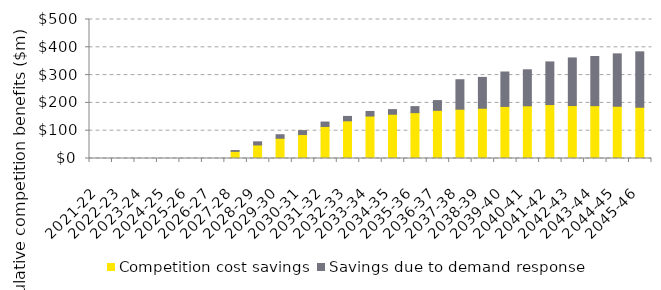
| Category | Competition cost savings | Savings due to demand response |
|---|---|---|
| 2021-22 | 0 | 0 |
| 2022-23 | 0 | 0 |
| 2023-24 | 0 | 0 |
| 2024-25 | 0 | 0 |
| 2025-26 | 0 | 0 |
| 2026-27 | 0 | 0 |
| 2027-28 | 25.619 | 3.027 |
| 2028-29 | 48.653 | 11.352 |
| 2029-30 | 72.781 | 12.762 |
| 2030-31 | 86.169 | 14.212 |
| 2031-32 | 115.223 | 15.941 |
| 2032-33 | 135.513 | 15.846 |
| 2033-34 | 152.656 | 16.566 |
| 2034-35 | 159.202 | 16.649 |
| 2035-36 | 164.921 | 21.783 |
| 2036-37 | 173.29 | 35.059 |
| 2037-38 | 177.349 | 105.992 |
| 2038-39 | 180.706 | 111.079 |
| 2039-40 | 187.328 | 123.793 |
| 2040-41 | 189.572 | 129.503 |
| 2041-42 | 194 | 153.389 |
| 2042-43 | 190.416 | 171.402 |
| 2043-44 | 190.024 | 176.908 |
| 2044-45 | 187.94 | 188.455 |
| 2045-46 | 184.416 | 199.239 |